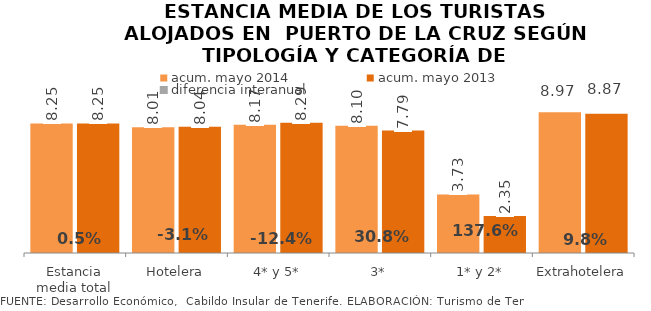
| Category | acum. mayo 2014 | acum. mayo 2013 |
|---|---|---|
| Estancia media total | 8.254 | 8.25 |
| Hotelera | 8.009 | 8.041 |
| 4* y 5* | 8.165 | 8.29 |
| 3* | 8.103 | 7.795 |
| 1* y 2* | 3.727 | 2.351 |
| Extrahotelera | 8.967 | 8.869 |